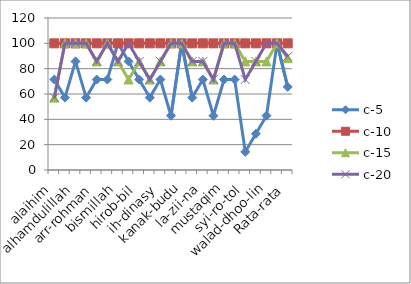
| Category | c-5 | c-10 | c-15 | c-20 |
|---|---|---|---|---|
| alaihim | 71.429 | 100 | 57.143 | 57.143 |
| a-lamin | 57.143 | 100 | 100 | 100 |
| alhamdulillah | 85.714 | 100 | 100 | 100 |
| an-am-ta | 57.143 | 100 | 100 | 100 |
| arr-rohman | 71.429 | 100 | 85.714 | 85.714 |
| bi-alai-him | 71.429 | 100 | 100 | 100 |
| bismillah | 100 | 100 | 85.714 | 85.714 |
| ghoi-ril-magh-du | 85.714 | 100 | 71.429 | 100 |
| hirob-bil | 71.429 | 100 | 85.714 | 85.714 |
| hirr-rohman | 57.143 | 100 | 71.429 | 71.429 |
| ih-dinasy | 71.429 | 100 | 85.714 | 85.714 |
| ii-yaa | 42.857 | 100 | 100 | 100 |
| kanak-budu | 100 | 100 | 100 | 100 |
| kanas-tain | 57.143 | 100 | 85.714 | 85.714 |
| la-zii-na | 71.429 | 100 | 85.714 | 85.714 |
| maa-lik-ki | 42.857 | 100 | 71.429 | 71.429 |
| mustaqim | 71.429 | 100 | 100 | 100 |
| nirr-rohim | 71.429 | 100 | 100 | 100 |
| syi-ro-tol | 14.286 | 100 | 85.714 | 71.429 |
| wa-ii-ya | 28.571 | 100 | 85.714 | 85.714 |
| walad-dhoo-lin | 42.857 | 100 | 85.714 | 100 |
| yau-midd-din | 100 | 100 | 100 | 100 |
| Rata-rata | 65.584 | 100 | 88.312 | 89.61 |